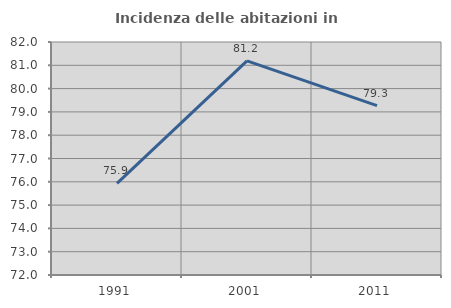
| Category | Incidenza delle abitazioni in proprietà  |
|---|---|
| 1991.0 | 75.933 |
| 2001.0 | 81.187 |
| 2011.0 | 79.271 |